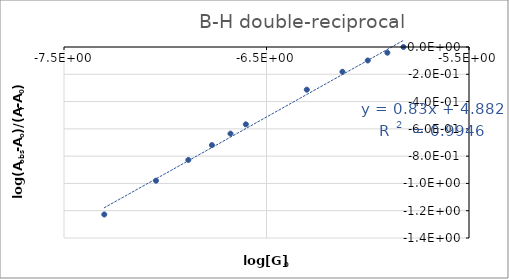
| Category | 325 nm |
|---|---|
| -7.301029995663981 | -1.228 |
| -7.045757490560675 | -0.98 |
| -6.886056647693163 | -0.828 |
| -6.769551078621726 | -0.719 |
| -6.6777807052660805 | -0.635 |
| -6.6020599913279625 | -0.567 |
| -6.301029995663981 | -0.313 |
| -6.1249387366083 | -0.181 |
| -6.0 | -0.099 |
| -5.903089986991944 | -0.042 |
| -5.823908740944319 | 0 |